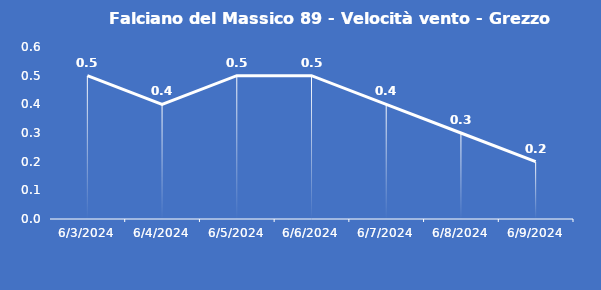
| Category | Falciano del Massico 89 - Velocità vento - Grezzo (m/s) |
|---|---|
| 6/3/24 | 0.5 |
| 6/4/24 | 0.4 |
| 6/5/24 | 0.5 |
| 6/6/24 | 0.5 |
| 6/7/24 | 0.4 |
| 6/8/24 | 0.3 |
| 6/9/24 | 0.2 |